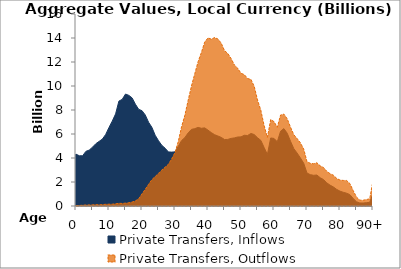
| Category | Private Transfers, Inflows | Private Transfers, Outflows |
|---|---|---|
| 0 | 4319.31 | 29.701 |
|  | 4187.718 | 43.542 |
| 2 | 4184.815 | 64.836 |
| 3 | 4553.872 | 85.356 |
| 4 | 4657.955 | 90.185 |
| 5 | 4898.842 | 95.892 |
| 6 | 5190.309 | 108.88 |
| 7 | 5382.675 | 105.377 |
| 8 | 5578.95 | 112.098 |
| 9 | 5962.364 | 141.639 |
| 10 | 6544.87 | 147.951 |
| 11 | 7078.301 | 153.074 |
| 12 | 7676.408 | 181.727 |
| 13 | 8739.637 | 226.971 |
| 14 | 8885.624 | 210.975 |
| 15 | 9330.506 | 238.793 |
| 16 | 9220.728 | 271.456 |
| 17 | 9008.537 | 326.825 |
| 18 | 8484.028 | 422.916 |
| 19 | 8056.095 | 599.182 |
| 20 | 7942.567 | 1012.395 |
| 21 | 7578.274 | 1395.102 |
| 22 | 6975.713 | 1807.739 |
| 23 | 6554.383 | 2200.174 |
| 24 | 5893.213 | 2454.312 |
| 25 | 5442.962 | 2721.085 |
| 26 | 5056.993 | 2995.689 |
| 27 | 4815.483 | 3231.767 |
| 28 | 4507.397 | 3473.636 |
| 29 | 4490.899 | 3929.063 |
| 30 | 4512.718 | 4455.256 |
| 31 | 4971.179 | 5378.781 |
| 32 | 5453.826 | 6612.853 |
| 33 | 5705.716 | 7571.249 |
| 34 | 6095.916 | 8823.295 |
| 35 | 6387.944 | 10007.547 |
| 36 | 6445.167 | 11028.546 |
| 37 | 6550.888 | 12027.862 |
| 38 | 6477.846 | 12788.067 |
| 39 | 6512.877 | 13658.427 |
| 40 | 6321.144 | 14010.538 |
| 41 | 6119.477 | 13905.079 |
| 42 | 5942.887 | 14034.44 |
| 43 | 5833.62 | 13920.444 |
| 44 | 5720.98 | 13571.981 |
| 45 | 5540.296 | 12951.52 |
| 46 | 5549.164 | 12709.591 |
| 47 | 5633.834 | 12288.479 |
| 48 | 5675.587 | 11750.141 |
| 49 | 5751.276 | 11479.246 |
| 50 | 5761.716 | 11059.865 |
| 51 | 5893.342 | 10950.558 |
| 52 | 5873.817 | 10620.131 |
| 53 | 6044.427 | 10553.759 |
| 54 | 5955.968 | 9971.942 |
| 55 | 5690.636 | 8833.496 |
| 56 | 5472.011 | 7988.471 |
| 57 | 4879.991 | 6708.288 |
| 58 | 4293.032 | 5718.362 |
| 59 | 5669.375 | 7202.139 |
| 60 | 5631.426 | 7031.142 |
| 61 | 5352.957 | 6561.851 |
| 62 | 6236.681 | 7585.134 |
| 63 | 6448.78 | 7657.331 |
| 64 | 6066.815 | 7271.205 |
| 65 | 5397.467 | 6572.641 |
| 66 | 4782.142 | 5941.211 |
| 67 | 4413.446 | 5621.524 |
| 68 | 4007.787 | 5263.271 |
| 69 | 3563.759 | 4743.265 |
| 70 | 2743.722 | 3692.207 |
| 71 | 2612.571 | 3555.375 |
| 72 | 2559.171 | 3520.632 |
| 73 | 2582.622 | 3602.687 |
| 74 | 2355.74 | 3343.654 |
| 75 | 2206.385 | 3211.947 |
| 76 | 1926.602 | 2888.853 |
| 77 | 1736.744 | 2693.186 |
| 78 | 1588.293 | 2563.926 |
| 79 | 1384.237 | 2298.083 |
| 80 | 1236.108 | 2161.327 |
| 81 | 1142.954 | 2130.108 |
| 82 | 1067.412 | 2125.084 |
| 83 | 947.603 | 1867.558 |
| 84 | 623.869 | 1283.426 |
| 85 | 354.537 | 745.712 |
| 86 | 254.191 | 486.796 |
| 87 | 247.726 | 476.769 |
| 88 | 277.686 | 538.964 |
| 89 | 304.708 | 594.735 |
| 90+ | 1038.782 | 2090.707 |